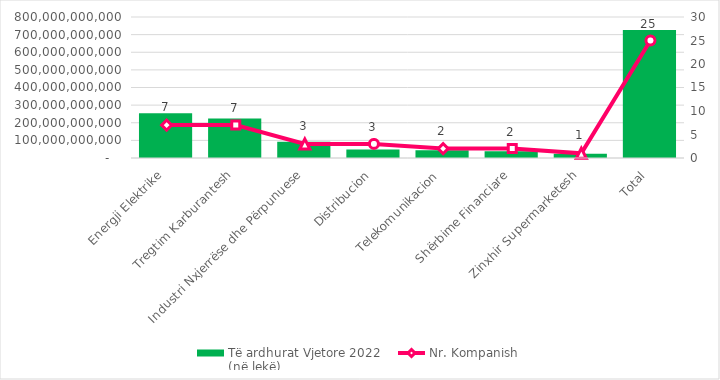
| Category | Të ardhurat Vjetore 2022
(në lekë) |
|---|---|
| Energji Elektrike | 254106456415 |
| Tregtim Karburantesh | 224726286136 |
| Industri Nxjerrëse dhe Përpunuese | 91674000000 |
| Distribucion | 48903765025 |
| Telekomunikacion | 44355308238 |
| Shërbime Financiare | 38011561000 |
| Zinxhir Supermarketesh | 24481000000 |
| Total | 726258376814 |